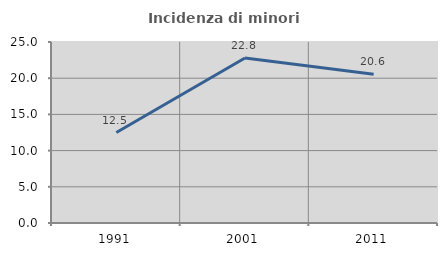
| Category | Incidenza di minori stranieri |
|---|---|
| 1991.0 | 12.5 |
| 2001.0 | 22.785 |
| 2011.0 | 20.557 |